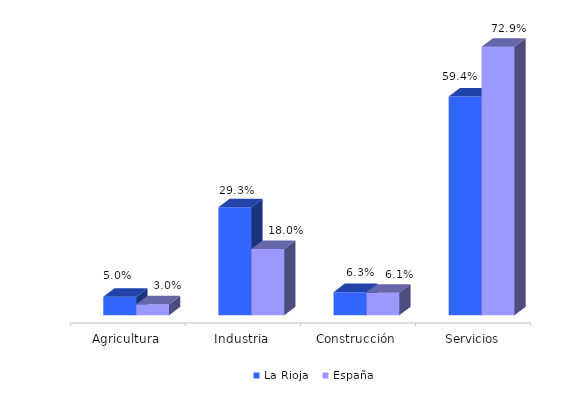
| Category | La Rioja | España |
|---|---|---|
| Agricultura | 0.05 | 0.03 |
| Industria | 0.293 | 0.18 |
| Construcción | 0.063 | 0.061 |
| Servicios | 0.594 | 0.729 |